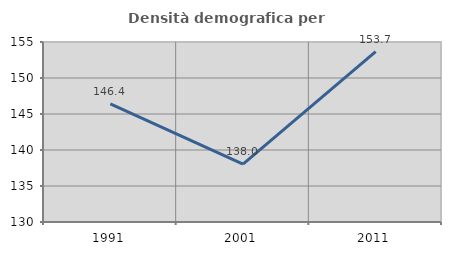
| Category | Densità demografica |
|---|---|
| 1991.0 | 146.401 |
| 2001.0 | 138.038 |
| 2011.0 | 153.672 |